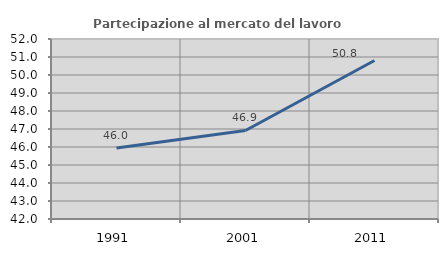
| Category | Partecipazione al mercato del lavoro  femminile |
|---|---|
| 1991.0 | 45.951 |
| 2001.0 | 46.918 |
| 2011.0 | 50.802 |